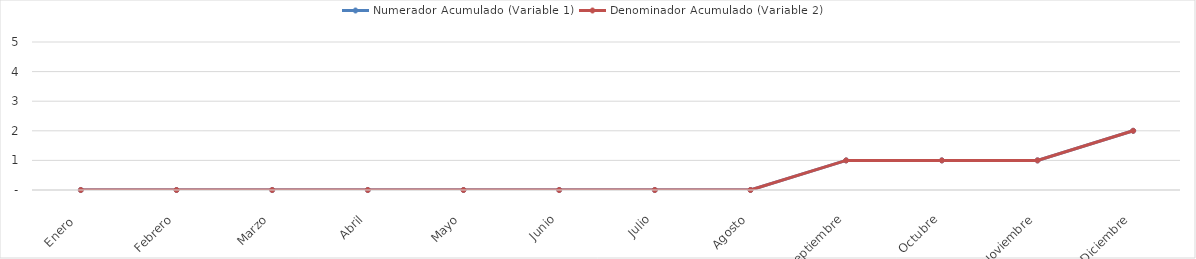
| Category | Numerador Acumulado (Variable 1) | Denominador Acumulado (Variable 2) |
|---|---|---|
| Enero  | 0 | 0 |
| Febrero | 0 | 0 |
| Marzo | 0 | 0 |
| Abril | 0 | 0 |
| Mayo | 0 | 0 |
| Junio | 0 | 0 |
| Julio | 0 | 0 |
| Agosto | 0 | 0 |
| Septiembre | 1 | 1 |
| Octubre | 1 | 1 |
| Noviembre | 1 | 1 |
| Diciembre | 2 | 2 |